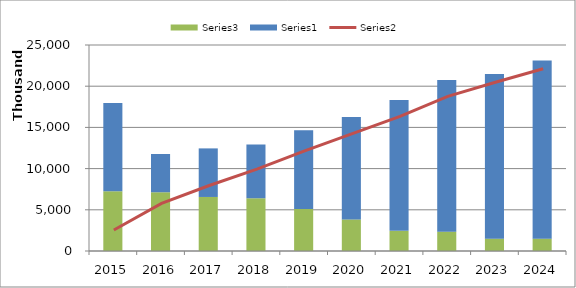
| Category | Series 2 | Series 0 |
|---|---|---|
| 2015.0 | 7257181 | 10715196 |
| 2016.0 | 7129323 | 4643675 |
| 2017.0 | 6557276 | 5894400 |
| 2018.0 | 6390929 | 6545408 |
| 2019.0 | 5108276 | 9545213 |
| 2020.0 | 3834612 | 12412574 |
| 2021.0 | 2450000 | 15876569 |
| 2022.0 | 2350000 | 18412299 |
| 2023.0 | 1500000 | 19971932 |
| 2024.0 | 1500000 | 21615231 |